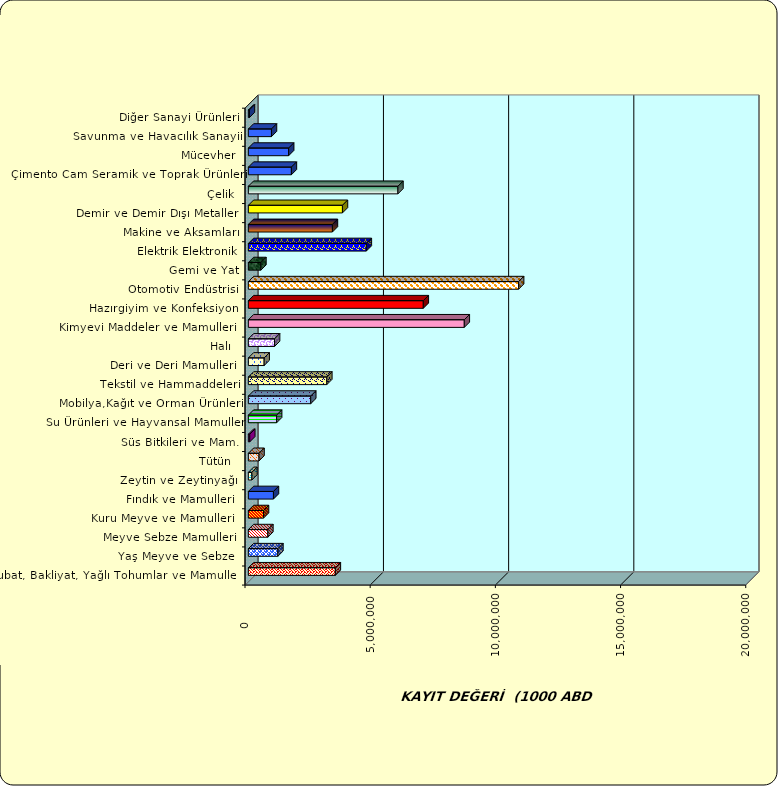
| Category | Series 0 |
|---|---|
|  Hububat, Bakliyat, Yağlı Tohumlar ve Mamulleri  | 3474021.655 |
|  Yaş Meyve ve Sebze   | 1179199.058 |
|  Meyve Sebze Mamulleri  | 778236.607 |
|  Kuru Meyve ve Mamulleri   | 604603.407 |
|  Fındık ve Mamulleri  | 1002227.598 |
|  Zeytin ve Zeytinyağı  | 140878.061 |
|  Tütün  | 426264.803 |
|  Süs Bitkileri ve Mam. | 56006.549 |
|  Su Ürünleri ve Hayvansal Mamuller | 1129080.145 |
|  Mobilya,Kağıt ve Orman Ürünleri | 2491611.58 |
|  Tekstil ve Hammaddeleri | 3134252.592 |
|  Deri ve Deri Mamulleri  | 630548.669 |
|  Halı  | 1046653.324 |
|  Kimyevi Maddeler ve Mamulleri   | 8624526.199 |
|  Hazırgiyim ve Konfeksiyon  | 6987196.49 |
|  Otomotiv Endüstrisi | 10793833.795 |
|  Gemi ve Yat | 500575.099 |
|  Elektrik Elektronik | 4711724.894 |
|  Makine ve Aksamları | 3357249.401 |
|  Demir ve Demir Dışı Metaller  | 3758062.235 |
|  Çelik | 5974318.68 |
|  Çimento Cam Seramik ve Toprak Ürünleri | 1718660.544 |
|  Mücevher | 1609644.162 |
|  Savunma ve Havacılık Sanayii | 922970.487 |
|  Diğer Sanayi Ürünleri | 43121.741 |